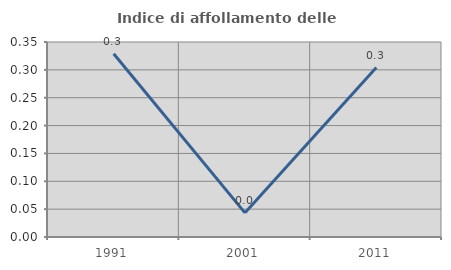
| Category | Indice di affollamento delle abitazioni  |
|---|---|
| 1991.0 | 0.329 |
| 2001.0 | 0.043 |
| 2011.0 | 0.304 |